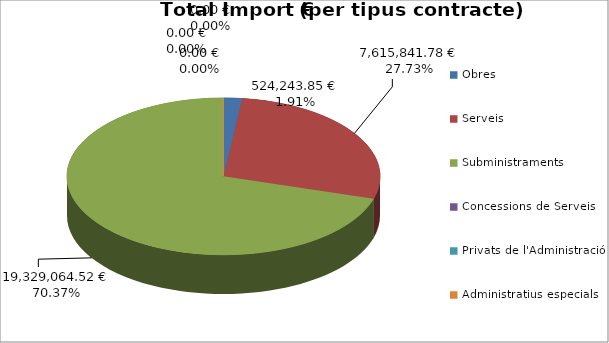
| Category | Total preu              (amb iva) |
|---|---|
| Obres | 524243.854 |
| Serveis | 7615841.78 |
| Subministraments | 19329064.52 |
| Concessions de Serveis | 0 |
| Privats de l'Administració | 0 |
| Administratius especials | 0 |